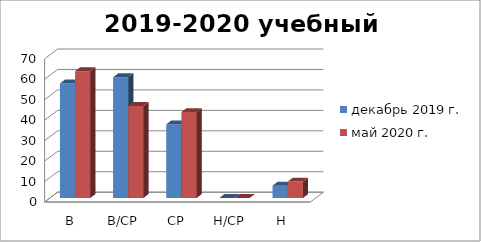
| Category | декабрь 2019 г. | май 2020 г. |
|---|---|---|
| В | 56 | 62 |
| В/СР | 59 | 45 |
| СР | 36 | 42 |
| Н/СР | 0 | 0 |
| Н | 6 | 8 |